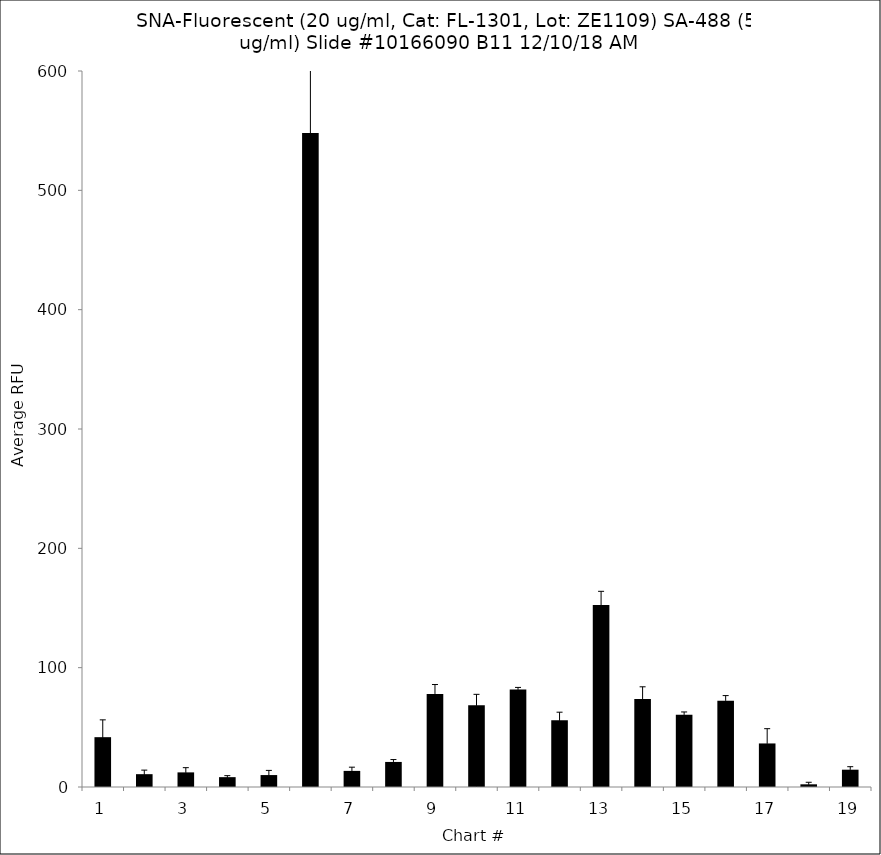
| Category | Series 0 |
|---|---|
| 1.0 | 41.75 |
| 2.0 | 10.75 |
| 3.0 | 12.25 |
| 4.0 | 8.25 |
| 5.0 | 10 |
| 6.0 | 548 |
| 7.0 | 13.5 |
| 8.0 | 21 |
| 9.0 | 78 |
| 10.0 | 68.5 |
| 11.0 | 81.75 |
| 12.0 | 56 |
| 13.0 | 152.5 |
| 14.0 | 73.75 |
| 15.0 | 60.5 |
| 16.0 | 72.25 |
| 17.0 | 36.5 |
| 18.0 | 2.25 |
| 19.0 | 14.5 |